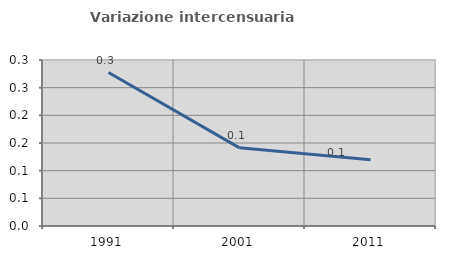
| Category | Variazione intercensuaria annua |
|---|---|
| 1991.0 | 0.277 |
| 2001.0 | 0.141 |
| 2011.0 | 0.12 |